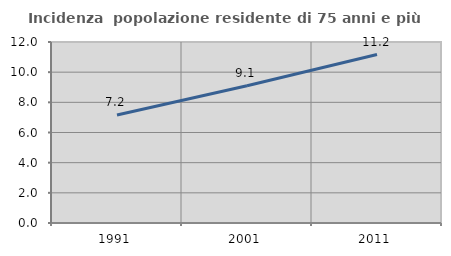
| Category | Incidenza  popolazione residente di 75 anni e più |
|---|---|
| 1991.0 | 7.166 |
| 2001.0 | 9.102 |
| 2011.0 | 11.17 |